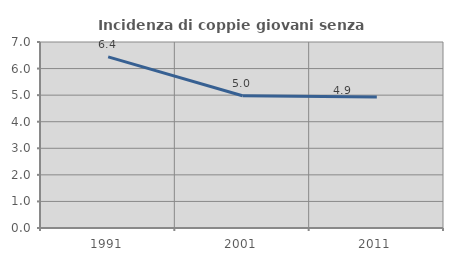
| Category | Incidenza di coppie giovani senza figli |
|---|---|
| 1991.0 | 6.439 |
| 2001.0 | 4.978 |
| 2011.0 | 4.93 |